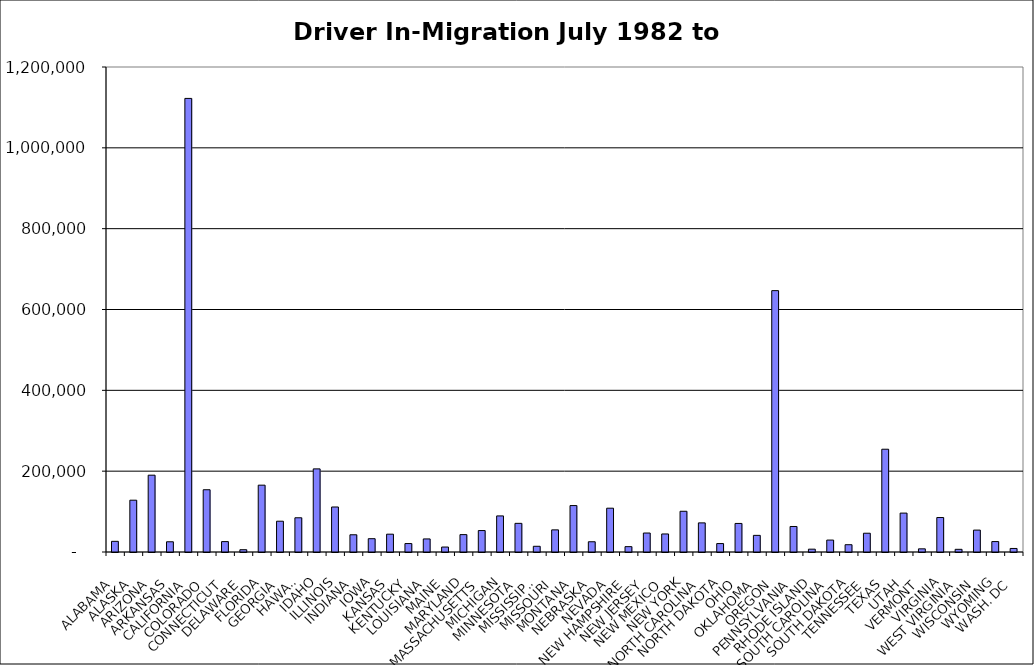
| Category | Series 0 |
|---|---|
| ALABAMA | 26396.5 |
| ALASKA | 128169.5 |
| ARIZONA | 190070 |
| ARKANSAS | 25304.5 |
| CALIFORNIA | 1122282.5 |
| COLORADO | 154037 |
| CONNECTICUT | 25733 |
| DELAWARE | 5644.5 |
| FLORIDA | 165382 |
| GEORGIA | 76163 |
| HAWAII | 84683.5 |
| IDAHO | 205669.5 |
| ILLINOIS | 111350.5 |
| INDIANA | 42611 |
| IOWA | 32901.5 |
| KANSAS | 44108.5 |
| KENTUCKY | 20898 |
| LOUISIANA | 32348.5 |
| MAINE | 12285.5 |
| MARYLAND | 43002 |
| MASSACHUSETTS | 53063 |
| MICHIGAN | 89298 |
| MINNESOTA | 70876.5 |
| MISSISSIPPI | 14117 |
| MISSOURI | 54780 |
| MONTANA | 114861 |
| NEBRASKA | 25333.5 |
| NEVADA | 108380 |
| NEW HAMPSHIRE | 13245.5 |
| NEW JERSEY | 46943 |
| NEW MEXICO | 44639 |
| NEW YORK | 100784 |
| NORTH CAROLINA | 72046.5 |
| NORTH DAKOTA | 20858.5 |
| OHIO | 70645.5 |
| OKLAHOMA | 41160 |
| OREGON | 646697 |
| PENNSYLVANIA | 63127.5 |
| RHODE ISLAND | 7003 |
| SOUTH CAROLINA | 29500.5 |
| SOUTH DAKOTA | 18033.5 |
| TENNESSEE | 46432.5 |
| TEXAS | 254267 |
| UTAH | 96253.5 |
| VERMONT | 7836 |
| VIRGINIA | 85300 |
| WEST VIRGINIA | 6621.5 |
| WISCONSIN | 54181.5 |
| WYOMING | 25805 |
| WASH. DC | 8771 |